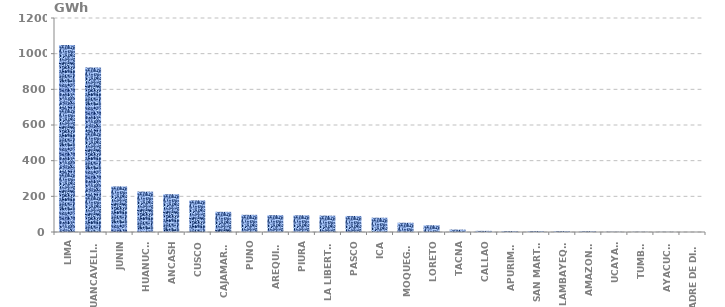
| Category | Series 0 |
|---|---|
| LIMA | 1048.906 |
| HUANCAVELICA | 922.427 |
| JUNIN | 255.467 |
| HUANUCO | 226.552 |
| ANCASH | 211.853 |
| CUSCO | 177.347 |
| CAJAMARCA | 113.143 |
| PUNO | 96.369 |
| AREQUIPA | 94.432 |
| PIURA | 93.713 |
| LA LIBERTAD | 91.779 |
| PASCO | 89.923 |
| ICA | 80.13 |
| MOQUEGUA | 51.926 |
| LORETO | 37.603 |
| TACNA | 13.488 |
| CALLAO | 6.416 |
| APURIMAC | 4.797 |
| SAN MARTÍN | 4.75 |
| LAMBAYEQUE | 4.635 |
| AMAZONAS | 4.058 |
| UCAYALI | 1.31 |
| TUMBES | 1.124 |
| AYACUCHO | 0.866 |
| MADRE DE DIOS | 0.141 |